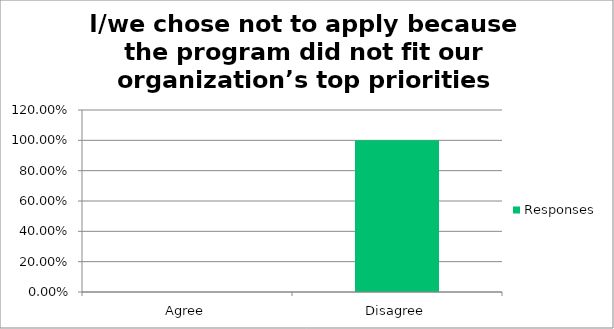
| Category | Responses |
|---|---|
| Agree | 0 |
| Disagree | 1 |